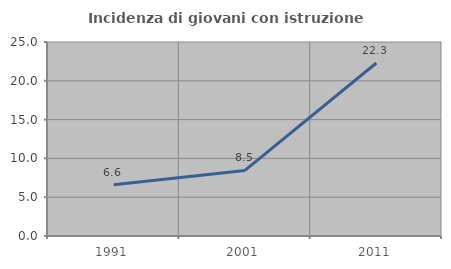
| Category | Incidenza di giovani con istruzione universitaria |
|---|---|
| 1991.0 | 6.615 |
| 2001.0 | 8.451 |
| 2011.0 | 22.293 |